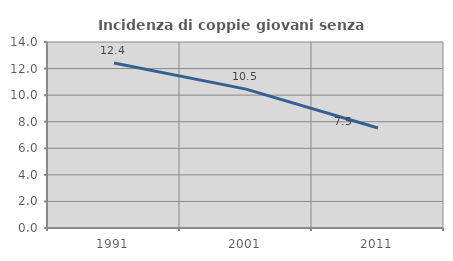
| Category | Incidenza di coppie giovani senza figli |
|---|---|
| 1991.0 | 12.417 |
| 2001.0 | 10.454 |
| 2011.0 | 7.524 |